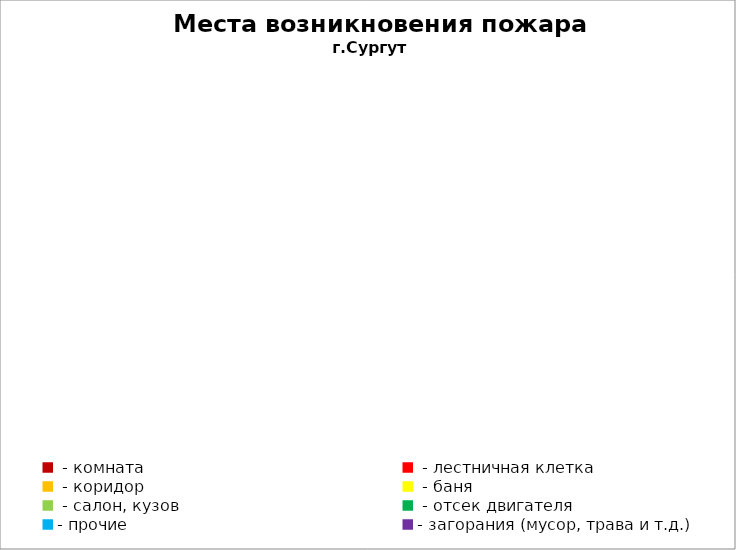
| Category | Места возникновения пожара |
|---|---|
|  - комната | 10 |
|  - лестничная клетка | 1 |
|  - коридор | 0 |
|  - баня | 2 |
|  - салон, кузов | 3 |
|  - отсек двигателя | 16 |
| - прочие | 39 |
| - загорания (мусор, трава и т.д.)  | 11 |